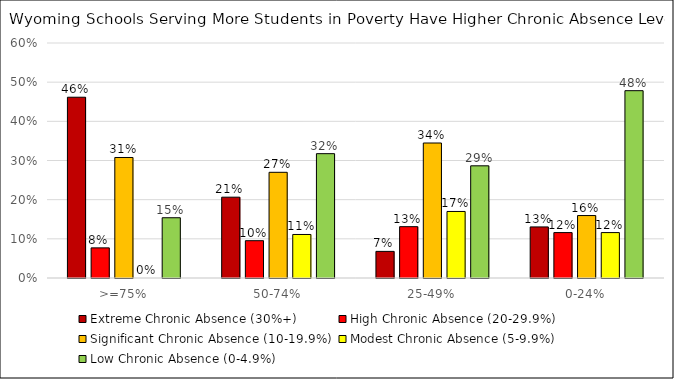
| Category | Extreme Chronic Absence (30%+) | High Chronic Absence (20-29.9%) | Significant Chronic Absence (10-19.9%) | Modest Chronic Absence (5-9.9%) | Low Chronic Absence (0-4.9%) |
|---|---|---|---|---|---|
| >=75% | 0.462 | 0.077 | 0.308 | 0 | 0.154 |
| 50-74% | 0.206 | 0.095 | 0.27 | 0.111 | 0.317 |
| 25-49% | 0.068 | 0.131 | 0.345 | 0.17 | 0.286 |
| 0-24% | 0.13 | 0.116 | 0.159 | 0.116 | 0.478 |